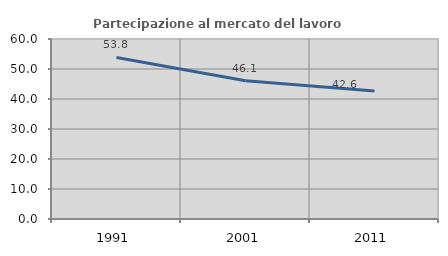
| Category | Partecipazione al mercato del lavoro  femminile |
|---|---|
| 1991.0 | 53.846 |
| 2001.0 | 46.083 |
| 2011.0 | 42.643 |